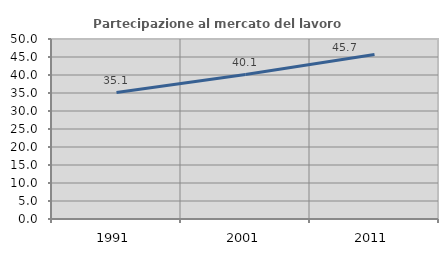
| Category | Partecipazione al mercato del lavoro  femminile |
|---|---|
| 1991.0 | 35.108 |
| 2001.0 | 40.11 |
| 2011.0 | 45.672 |